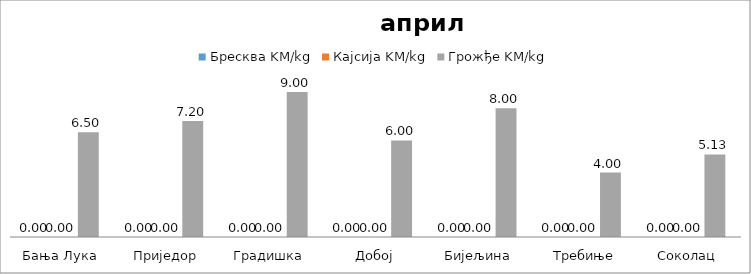
| Category | Бресква KM/kg | Кајсија KM/kg | Грожђе KM/kg |
|---|---|---|---|
| Бања Лука | 0 | 0 | 6.5 |
| Приједор | 0 | 0 | 7.2 |
| Градишка | 0 | 0 | 9 |
| Добој | 0 | 0 | 6 |
| Бијељина | 0 | 0 | 8 |
|  Требиње | 0 | 0 | 4 |
| Соколац | 0 | 0 | 5.13 |